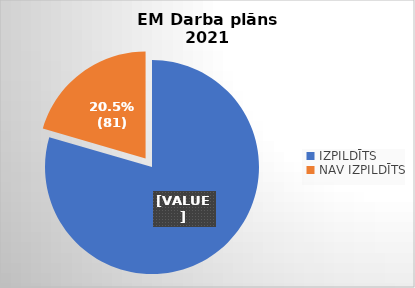
| Category | Series 0 |
|---|---|
| IZPILDĪTS | 0.795 |
| NAV IZPILDĪTS | 0.205 |